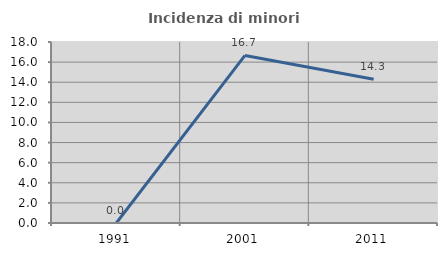
| Category | Incidenza di minori stranieri |
|---|---|
| 1991.0 | 0 |
| 2001.0 | 16.667 |
| 2011.0 | 14.286 |